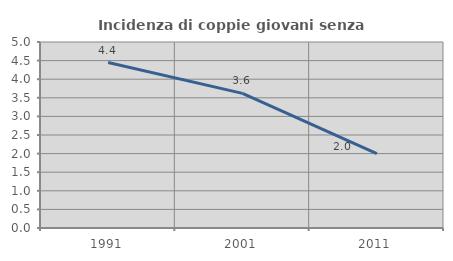
| Category | Incidenza di coppie giovani senza figli |
|---|---|
| 1991.0 | 4.448 |
| 2001.0 | 3.618 |
| 2011.0 | 2.001 |